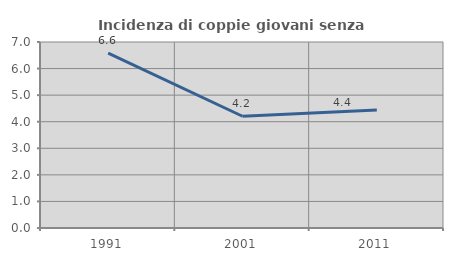
| Category | Incidenza di coppie giovani senza figli |
|---|---|
| 1991.0 | 6.579 |
| 2001.0 | 4.206 |
| 2011.0 | 4.444 |